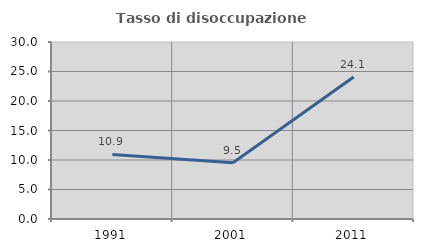
| Category | Tasso di disoccupazione giovanile  |
|---|---|
| 1991.0 | 10.938 |
| 2001.0 | 9.524 |
| 2011.0 | 24.074 |